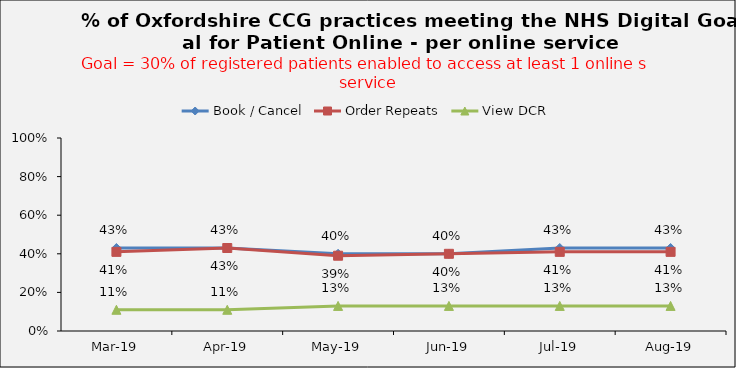
| Category | Book / Cancel | Order Repeats | View DCR |
|---|---|---|---|
| 2019-03-01 | 0.43 | 0.41 | 0.11 |
| 2019-04-01 | 0.43 | 0.43 | 0.11 |
| 2019-05-01 | 0.4 | 0.39 | 0.13 |
| 2019-06-01 | 0.4 | 0.4 | 0.13 |
| 2019-07-01 | 0.43 | 0.41 | 0.13 |
| 2019-08-01 | 0.43 | 0.41 | 0.13 |